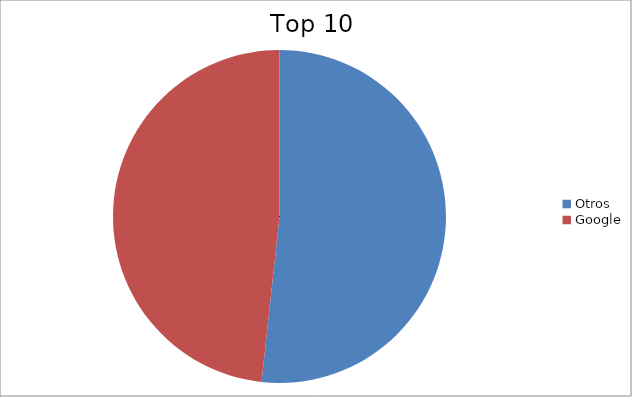
| Category | Series 0 |
|---|---|
| Otros | 51.72 |
| Google | 48.28 |